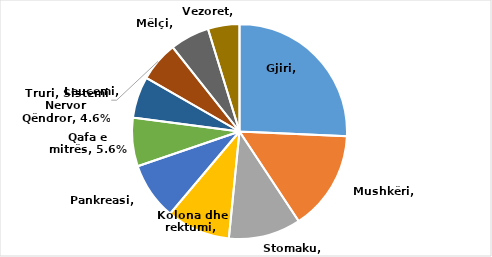
| Category | Series 0 |
|---|---|
| Gjiri | 0.197 |
| Mushkëri | 0.115 |
| Stomaku | 0.083 |
| Kolona dhe rektumi | 0.074 |
| Pankreasi | 0.066 |
| Qafa e mitrës | 0.056 |
| Leuçemi | 0.048 |
| Truri, Sistemi Nervor Qëndror | 0.046 |
| Mëlçi | 0.045 |
| Vezoret | 0.036 |